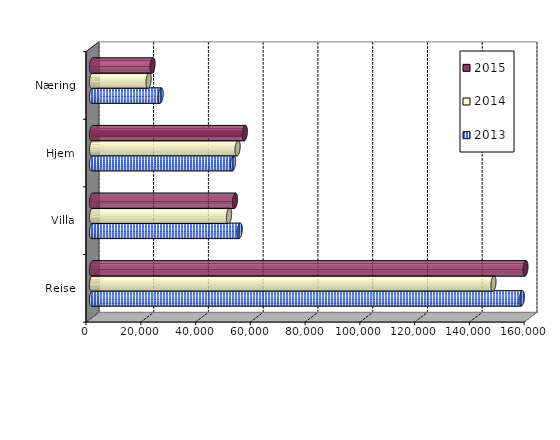
| Category | 2013 | 2014 | 2015 |
|---|---|---|---|
| Reise | 156964 | 146608 | 158299 |
| Villa | 53950 | 50045 | 52228.503 |
| Hjem | 51497 | 53178 | 55817.752 |
| Næring | 25068 | 20669 | 22114.084 |